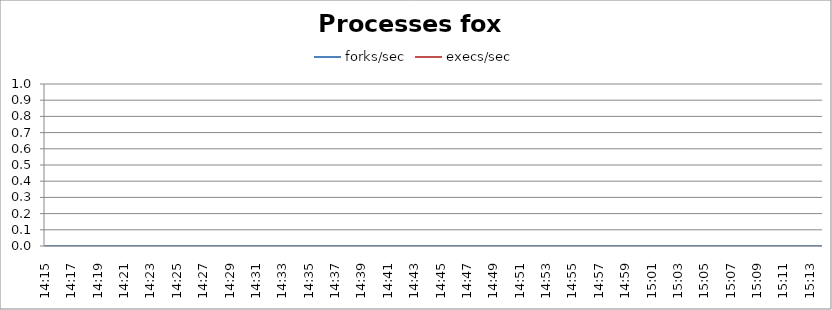
| Category | forks/sec | execs/sec |
|---|---|---|
| 14:15 | 0 | -1 |
| 14:16 | 0 | -1 |
| 14:17 | 0 | -1 |
| 14:18 | 0 | -1 |
| 14:19 | 0 | -1 |
| 14:20 | 0 | -1 |
| 14:21 | 0 | -1 |
| 14:22 | 0 | -1 |
| 14:23 | 0 | -1 |
| 14:24 | 0 | -1 |
| 14:25 | 0 | -1 |
| 14:26 | 0 | -1 |
| 14:27 | 0 | -1 |
| 14:28 | 0 | -1 |
| 14:29 | 0 | -1 |
| 14:30 | 0 | -1 |
| 14:31 | 0 | -1 |
| 14:32 | 0 | -1 |
| 14:33 | 0 | -1 |
| 14:34 | 0 | -1 |
| 14:35 | 0 | -1 |
| 14:36 | 0 | -1 |
| 14:37 | 0 | -1 |
| 14:38 | 0 | -1 |
| 14:39 | 0 | -1 |
| 14:40 | 0 | -1 |
| 14:41 | 0 | -1 |
| 14:42 | 0 | -1 |
| 14:43 | 0 | -1 |
| 14:44 | 0 | -1 |
| 14:45 | 0 | -1 |
| 14:46 | 0 | -1 |
| 14:47 | 0 | -1 |
| 14:48 | 0 | -1 |
| 14:49 | 0 | -1 |
| 14:50 | 0 | -1 |
| 14:51 | 0 | -1 |
| 14:52 | 0 | -1 |
| 14:53 | 0 | -1 |
| 14:54 | 0 | -1 |
| 14:55 | 0 | -1 |
| 14:56 | 0 | -1 |
| 14:57 | 0 | -1 |
| 14:58 | 0 | -1 |
| 14:59 | 0 | -1 |
| 15:00 | 0 | -1 |
| 15:01 | 0 | -1 |
| 15:02 | 0 | -1 |
| 15:03 | 0 | -1 |
| 15:04 | 0 | -1 |
| 15:05 | 0 | -1 |
| 15:06 | 0 | -1 |
| 15:07 | 0 | -1 |
| 15:08 | 0 | -1 |
| 15:09 | 0 | -1 |
| 15:10 | 0 | -1 |
| 15:11 | 0 | -1 |
| 15:12 | 0 | -1 |
| 15:13 | 0 | -1 |
| 15:14 | 0 | -1 |